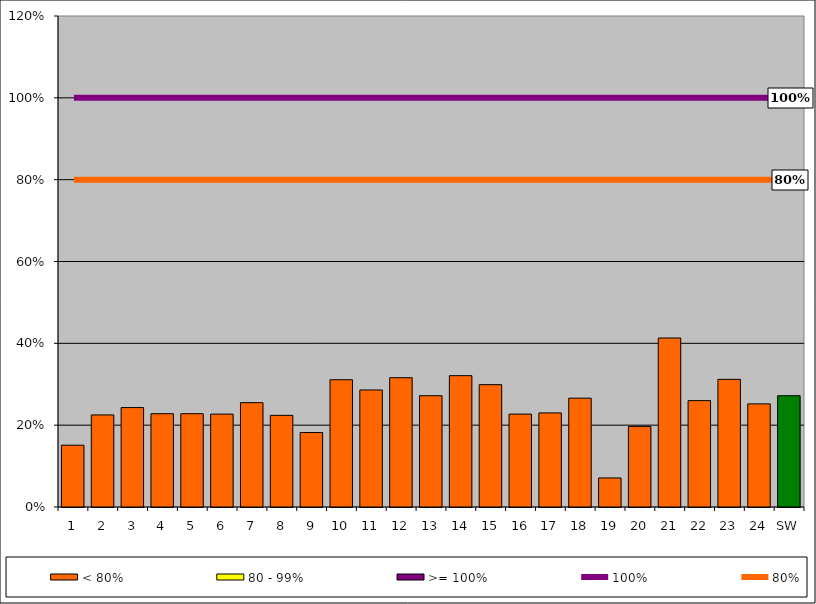
| Category | < 80% | 80 - 99% | >= 100% |
|---|---|---|---|
| 1 | 0.151 | 0 | 0 |
| 2 | 0.225 | 0 | 0 |
| 3 | 0.243 | 0 | 0 |
| 4 | 0.228 | 0 | 0 |
| 5 | 0.228 | 0 | 0 |
| 6 | 0.227 | 0 | 0 |
| 7 | 0.255 | 0 | 0 |
| 8 | 0.224 | 0 | 0 |
| 9 | 0.182 | 0 | 0 |
| 10 | 0.311 | 0 | 0 |
| 11 | 0.286 | 0 | 0 |
| 12 | 0.316 | 0 | 0 |
| 13 | 0.272 | 0 | 0 |
| 14 | 0.321 | 0 | 0 |
| 15 | 0.299 | 0 | 0 |
| 16 | 0.227 | 0 | 0 |
| 17 | 0.23 | 0 | 0 |
| 18 | 0.266 | 0 | 0 |
| 19 | 0.071 | 0 | 0 |
| 20 | 0.197 | 0 | 0 |
| 21 | 0.413 | 0 | 0 |
| 22 | 0.26 | 0 | 0 |
| 23 | 0.312 | 0 | 0 |
| 24 | 0.252 | 0 | 0 |
| SW | 0.272 | 0 | 0 |